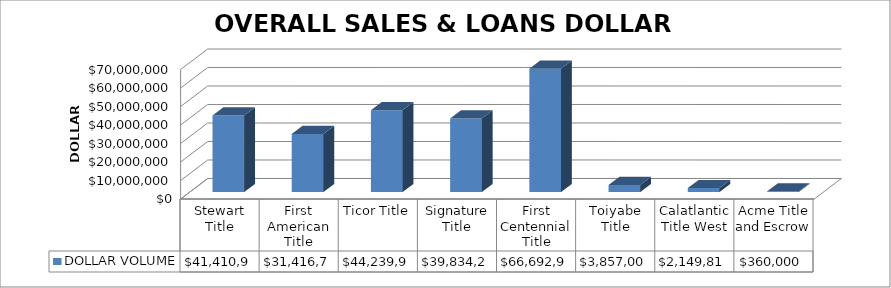
| Category | DOLLAR VOLUME |
|---|---|
| Stewart Title | 41410908.81 |
| First American Title | 31416738 |
| Ticor Title | 44239934 |
| Signature Title | 39834200 |
| First Centennial Title | 66692999 |
| Toiyabe Title | 3857000 |
| Calatlantic Title West | 2149817 |
| Acme Title and Escrow | 360000 |